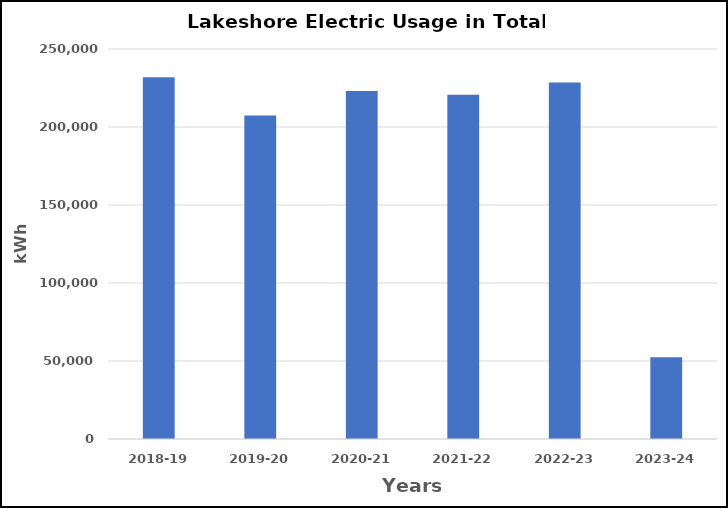
| Category | Series 0 |
|---|---|
| 2018-19 | 231963 |
| 2019-20 | 207447 |
| 2020-21 | 223114 |
| 2021-22 | 220743 |
| 2022-23 | 228471 |
| 2023-24 | 52397 |